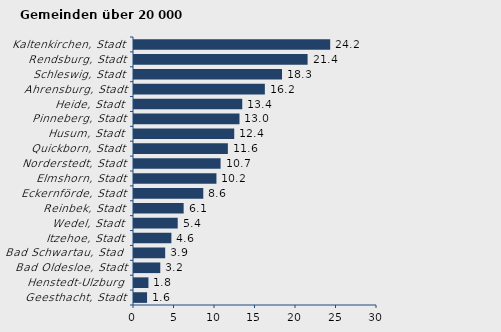
| Category | Wanderungssaldo |
|---|---|
| Geesthacht, Stadt | 1.611 |
| Henstedt-Ulzburg | 1.782 |
| Bad Oldesloe, Stadt | 3.245 |
| Bad Schwartau, Stadt | 3.851 |
| Itzehoe, Stadt | 4.616 |
| Wedel, Stadt | 5.398 |
| Reinbek, Stadt | 6.129 |
| Eckernförde, Stadt | 8.554 |
| Elmshorn, Stadt | 10.178 |
| Norderstedt, Stadt | 10.689 |
| Quickborn, Stadt | 11.588 |
| Husum, Stadt | 12.374 |
| Pinneberg, Stadt | 13.023 |
| Heide, Stadt | 13.365 |
| Ahrensburg, Stadt | 16.154 |
| Schleswig, Stadt | 18.274 |
| Rendsburg, Stadt | 21.432 |
| Kaltenkirchen, Stadt | 24.221 |